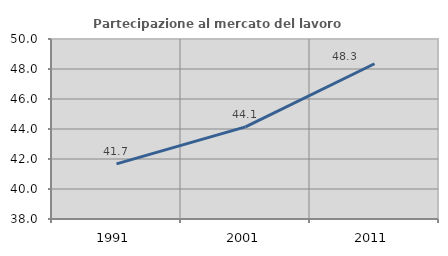
| Category | Partecipazione al mercato del lavoro  femminile |
|---|---|
| 1991.0 | 41.675 |
| 2001.0 | 44.142 |
| 2011.0 | 48.348 |